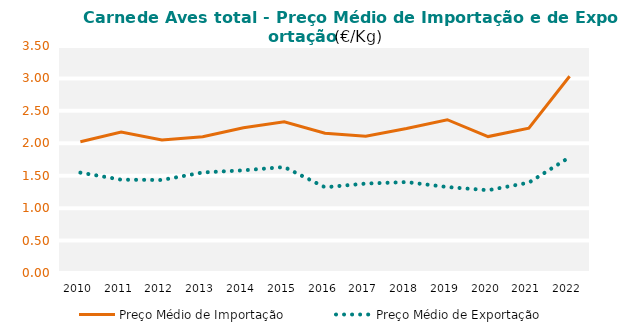
| Category | Preço Médio de Importação | Preço Médio de Exportação |
|---|---|---|
| 2010.0 | 2.024 | 1.547 |
| 2011.0 | 2.175 | 1.439 |
| 2012.0 | 2.05 | 1.434 |
| 2013.0 | 2.1 | 1.55 |
| 2014.0 | 2.24 | 1.583 |
| 2015.0 | 2.331 | 1.634 |
| 2016.0 | 2.154 | 1.322 |
| 2017.0 | 2.11 | 1.379 |
| 2018.0 | 2.227 | 1.402 |
| 2019.0 | 2.363 | 1.325 |
| 2020.0 | 2.103 | 1.276 |
| 2021.0 | 2.234 | 1.393 |
| 2022.0 | 3.034 | 1.785 |